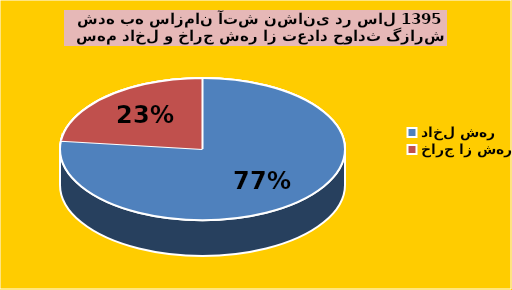
| Category | Series 0 |
|---|---|
| داخل شهر | 1002 |
| خارج از شهر | 301 |